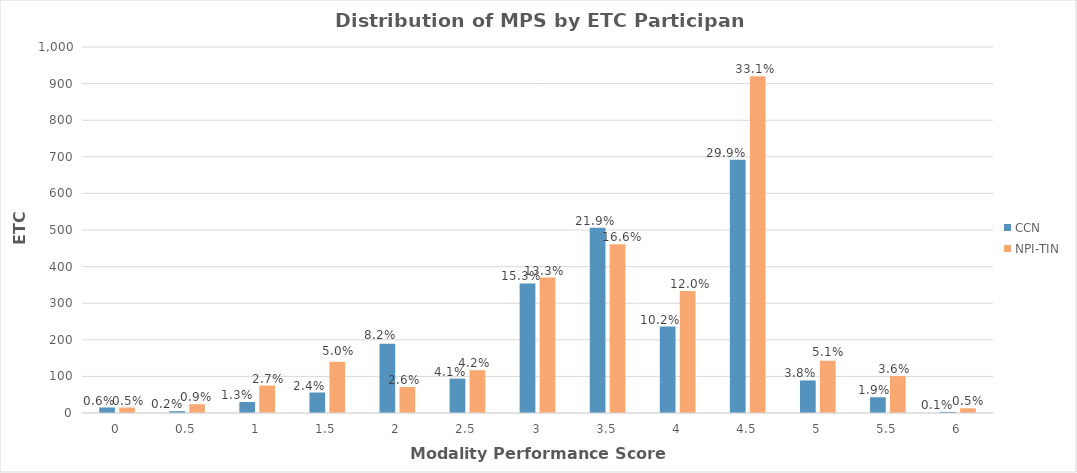
| Category | CCN | NPI-TIN |
|---|---|---|
| 0.0 | 15 | 15 |
| 0.5 | 5 | 24 |
| 1.0 | 30 | 75 |
| 1.5 | 56 | 140 |
| 2.0 | 189 | 71 |
| 2.5 | 94 | 117 |
| 3.0 | 354 | 370 |
| 3.5 | 506 | 461 |
| 4.0 | 236 | 333 |
| 4.5 | 692 | 920 |
| 5.0 | 89 | 143 |
| 5.5 | 43 | 101 |
| 6.0 | 3 | 13 |